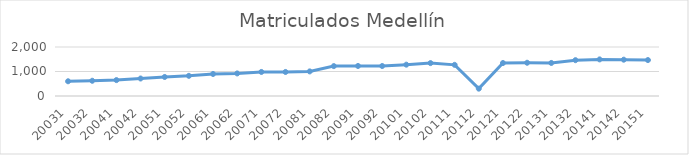
| Category | Matriculados Medellín |
|---|---|
| 20031 | 601 |
| 20032 | 622 |
| 20041 | 649 |
| 20042 | 714 |
| 20051 | 777 |
| 20052 | 823 |
| 20061 | 899 |
| 20062 | 921 |
| 20071 | 981 |
| 20072 | 981 |
| 20081 | 1004 |
| 20082 | 1220 |
| 20091 | 1226 |
| 20092 | 1224 |
| 20101 | 1279 |
| 20102 | 1343 |
| 20111 | 1272 |
| 20112 | 300 |
| 20121 | 1346 |
| 20122 | 1357 |
| 20131 | 1349 |
| 20132 | 1462 |
| 20141 | 1494 |
| 20142 | 1482 |
| 20151 | 1467 |